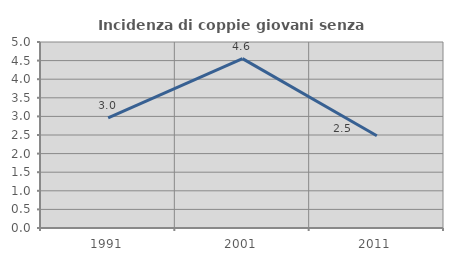
| Category | Incidenza di coppie giovani senza figli |
|---|---|
| 1991.0 | 2.962 |
| 2001.0 | 4.553 |
| 2011.0 | 2.481 |